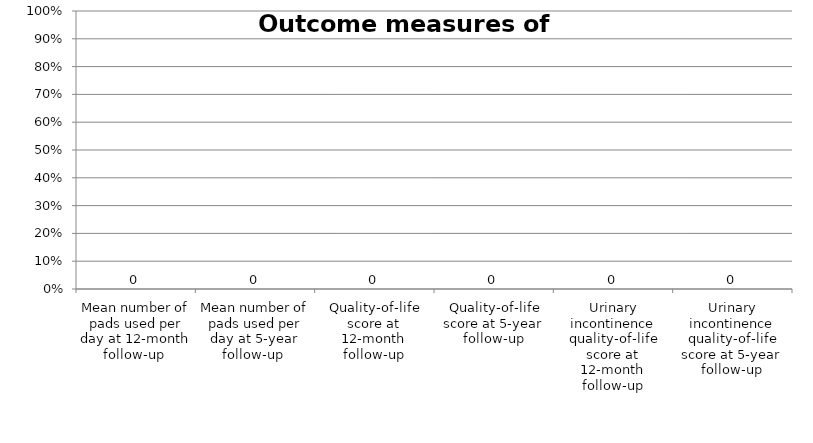
| Category | Series 0 |
|---|---|
| Mean number of pads used per day at 12-month follow-up  | 0 |
| Mean number of pads used per day at 5-year follow-up  | 0 |
| Quality-of-life score at 12-month follow-up | 0 |
| Quality-of-life score at 5-year follow-up | 0 |
| Urinary incontinence quality-of-life score at 12-month follow-up | 0 |
| Urinary incontinence quality-of-life score at 5-year follow-up | 0 |